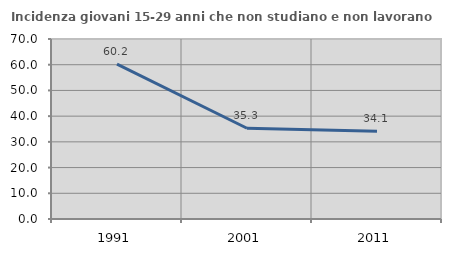
| Category | Incidenza giovani 15-29 anni che non studiano e non lavorano  |
|---|---|
| 1991.0 | 60.213 |
| 2001.0 | 35.299 |
| 2011.0 | 34.099 |